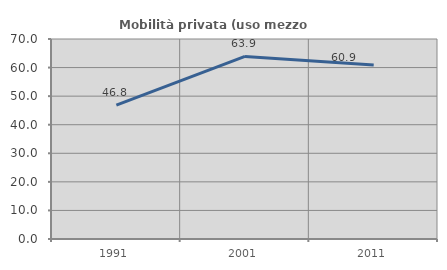
| Category | Mobilità privata (uso mezzo privato) |
|---|---|
| 1991.0 | 46.838 |
| 2001.0 | 63.918 |
| 2011.0 | 60.92 |